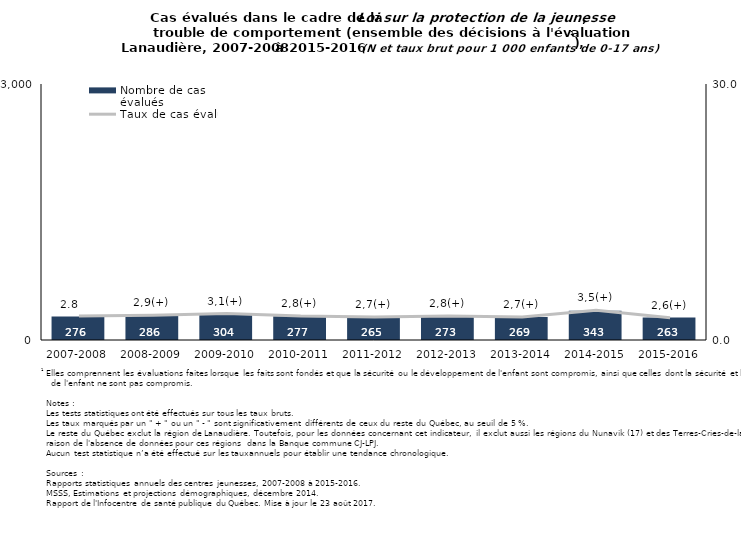
| Category | Nombre de cas évalués |
|---|---|
| 2007-2008 | 276 |
| 2008-2009 | 286 |
| 2009-2010 | 304 |
| 2010-2011 | 277 |
| 2011-2012 | 265 |
| 2012-2013 | 273 |
| 2013-2014 | 269 |
| 2014-2015 | 343 |
| 2015-2016 | 263 |